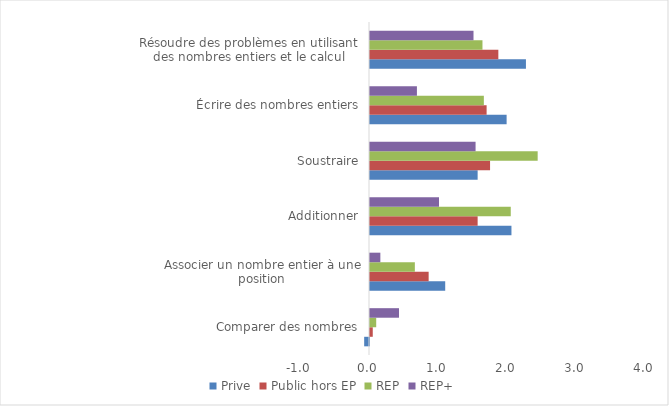
| Category | Prive | Public hors EP | REP | REP+ |
|---|---|---|---|---|
| Comparer des nombres | -0.07 | 0.04 | 0.09 | 0.42 |
| Associer un nombre entier à une position | 1.09 | 0.85 | 0.65 | 0.15 |
| Additionner | 2.05 | 1.56 | 2.04 | 1 |
| Soustraire | 1.56 | 1.74 | 2.43 | 1.53 |
| Écrire des nombres entiers | 1.98 | 1.69 | 1.65 | 0.68 |
| Résoudre des problèmes en utilisant des nombres entiers et le calcul | 2.26 | 1.86 | 1.63 | 1.5 |